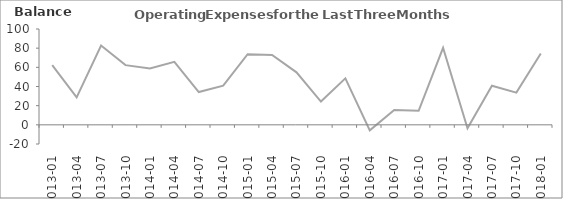
| Category | Balance |
|---|---|
| 2013-01 | 62.3 |
| 2013-04 | 28.6 |
| 2013-07 | 82.8 |
| 2013-10 | 62.3 |
| 2014-01 | 58.7 |
| 2014-04 | 65.7 |
| 2014-07 | 34.2 |
| 2014-10 | 40.8 |
| 2015-01 | 73.7 |
| 2015-04 | 72.9 |
| 2015-07 | 54.8 |
| 2015-10 | 24.3 |
| 2016-01 | 48.5 |
| 2016-04 | -5.8 |
| 2016-07 | 15.4 |
| 2016-10 | 14.6 |
| 2017-01 | 80.4 |
| 2017-04 | -3.6 |
| 2017-07 | 40.8 |
| 2017-10 | 33.6 |
| 2018-01 | 74.5 |